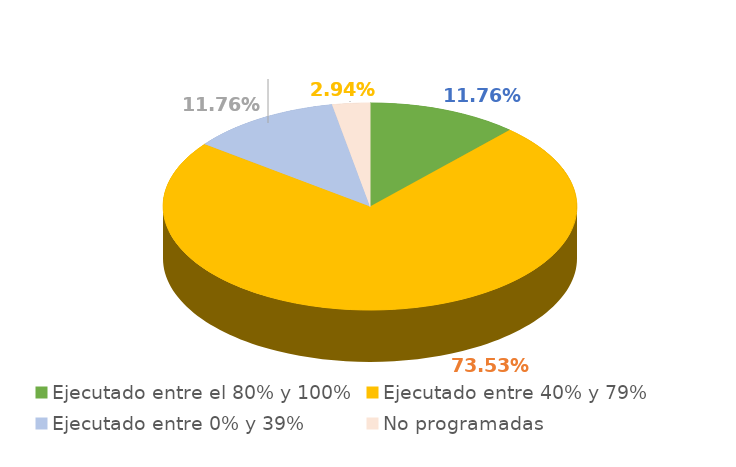
| Category | Series 0 |
|---|---|
| Ejecutado entre el 80% y 100% | 0.118 |
| Ejecutado entre 40% y 79% | 0.735 |
| Ejecutado entre 0% y 39% | 0.118 |
| No programadas | 0.029 |